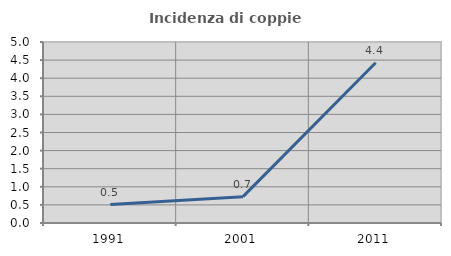
| Category | Incidenza di coppie miste |
|---|---|
| 1991.0 | 0.51 |
| 2001.0 | 0.727 |
| 2011.0 | 4.426 |